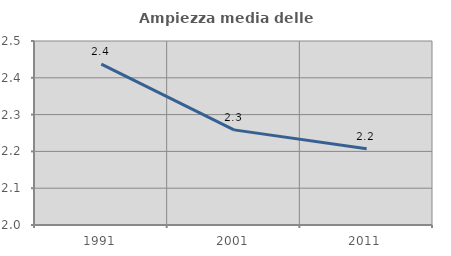
| Category | Ampiezza media delle famiglie |
|---|---|
| 1991.0 | 2.437 |
| 2001.0 | 2.258 |
| 2011.0 | 2.207 |